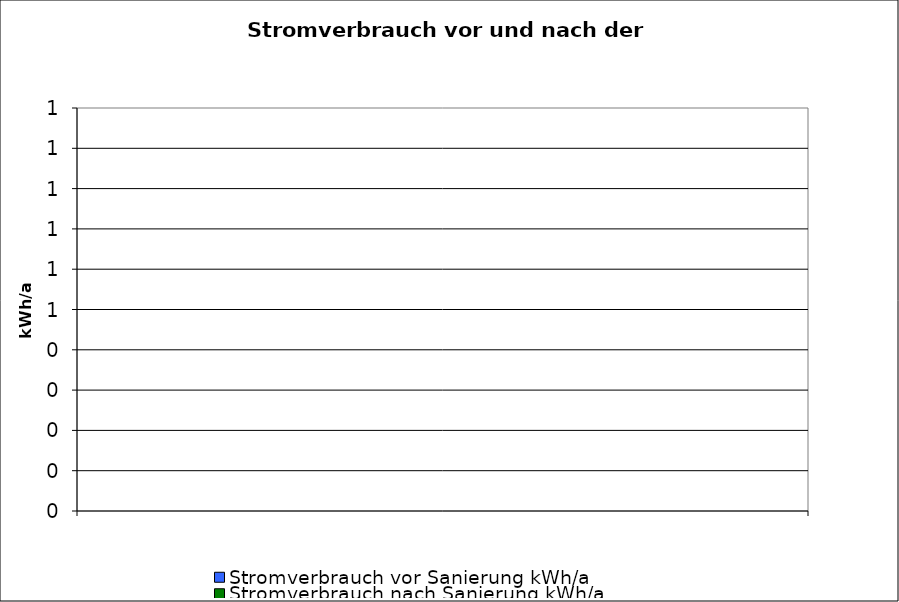
| Category | Stromverbrauch vor Sanierung | Stromverbrauch nach Sanierung |
|---|---|---|
| 0 | 0 | 0 |